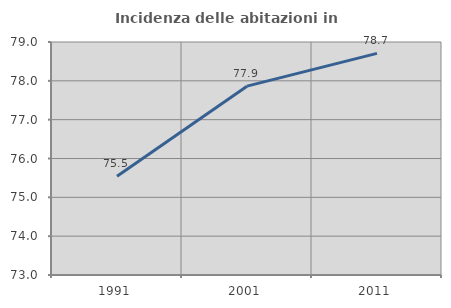
| Category | Incidenza delle abitazioni in proprietà  |
|---|---|
| 1991.0 | 75.542 |
| 2001.0 | 77.863 |
| 2011.0 | 78.707 |